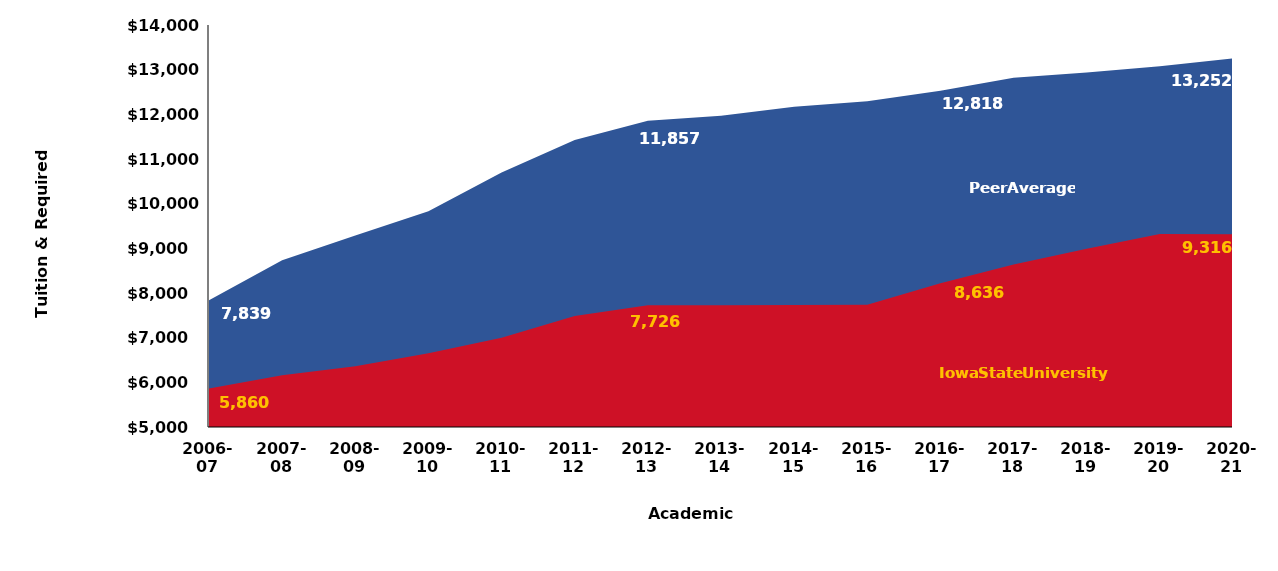
| Category | Peer Average | Iowa State University |
|---|---|---|
| 2006-
07 | 7839.415 | 5860 |
| 2007-
08 | 8734.088 | 6161.32 |
| 2008-
09 | 9289.001 | 6360 |
| 2009-
10 | 9830.583 | 6651 |
| 2010-
11 | 10698.1 | 6997 |
| 2011-
12 | 11423.4 | 7486 |
| 2012-
13 | 11856.7 | 7726 |
| 2013-
14 | 11970.78 | 7726 |
| 2014-
15 | 12168.48 | 7731.4 |
| 2015-
16 | 12290.456 | 7735.9 |
| 2016-
17 | 12528.628 | 8219.4 |
| 2017-
18 | 12817.8 | 8635.9 |
| 2018-
19 | 12935.492 | 8988.4 |
| 2019-
20 | 13077.572 | 9319.9 |
| 2020-
21 | 13252 | 9316 |